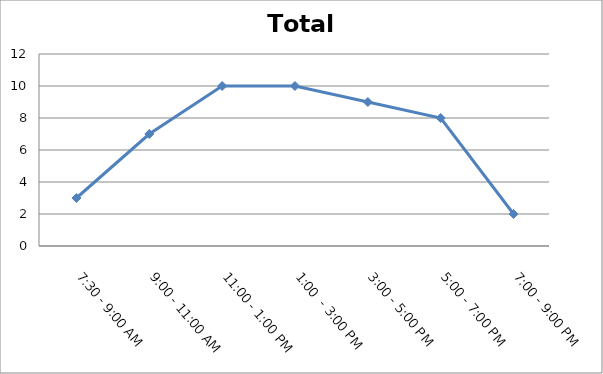
| Category | Total |
|---|---|
| 7:30 - 9:00 AM | 3 |
| 9:00 - 11:00 AM | 7 |
| 11:00 - 1:00 PM | 10 |
| 1:00  - 3:00 PM | 10 |
| 3:00 - 5:00 PM | 9 |
| 5:00 - 7:00 PM | 8 |
| 7:00 - 9:00 PM | 2 |